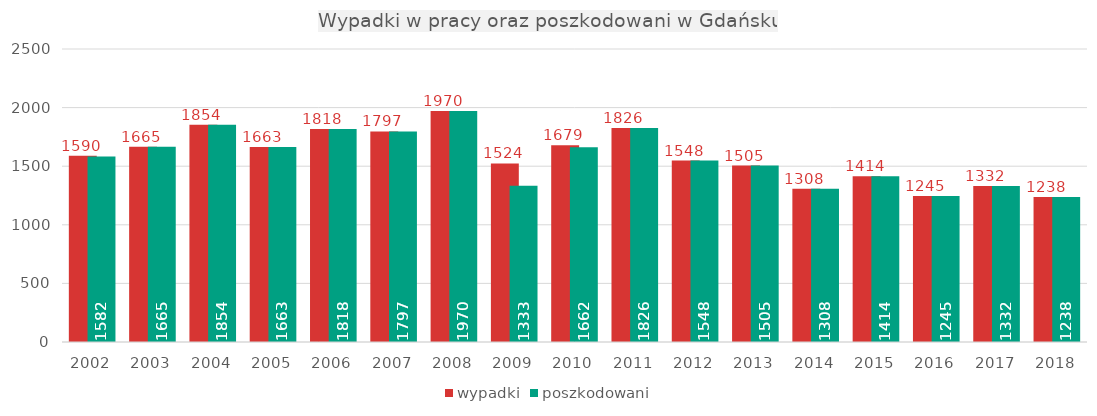
| Category | wypadki | poszkodowani |
|---|---|---|
| 2002.0 | 1590 | 1582 |
| 2003.0 | 1665 | 1665 |
| 2004.0 | 1854 | 1854 |
| 2005.0 | 1663 | 1663 |
| 2006.0 | 1818 | 1818 |
| 2007.0 | 1797 | 1797 |
| 2008.0 | 1970 | 1970 |
| 2009.0 | 1524 | 1333 |
| 2010.0 | 1679 | 1662 |
| 2011.0 | 1826 | 1826 |
| 2012.0 | 1548 | 1548 |
| 2013.0 | 1505 | 1505 |
| 2014.0 | 1308 | 1308 |
| 2015.0 | 1414 | 1414 |
| 2016.0 | 1245 | 1245 |
| 2017.0 | 1332 | 1332 |
| 2018.0 | 1238 | 1238 |